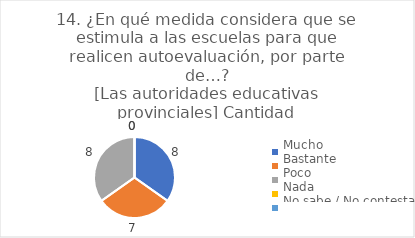
| Category | 14. ¿En qué medida considera que se estimula a las escuelas para que realicen autoevaluación, por parte de…?
[Las autoridades educativas provinciales] |
|---|---|
| Mucho  | 0.348 |
| Bastante  | 0.304 |
| Poco  | 0.348 |
| Nada  | 0 |
| No sabe / No contesta | 0 |